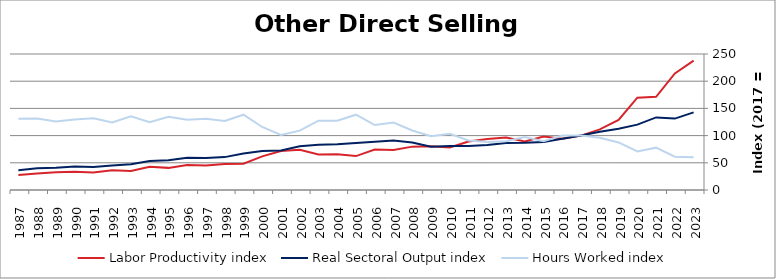
| Category | Labor Productivity index | Real Sectoral Output index | Hours Worked index |
|---|---|---|---|
| 2023.0 | 237.944 | 142.778 | 60.005 |
| 2022.0 | 214.311 | 131.26 | 61.247 |
| 2021.0 | 171.4 | 133.447 | 77.857 |
| 2020.0 | 169.617 | 120.177 | 70.852 |
| 2019.0 | 128.907 | 112.681 | 87.413 |
| 2018.0 | 111.369 | 107.081 | 96.15 |
| 2017.0 | 100 | 100 | 100 |
| 2016.0 | 94.161 | 94.391 | 100.244 |
| 2015.0 | 98.391 | 88.368 | 89.814 |
| 2014.0 | 89.083 | 86.84 | 97.482 |
| 2013.0 | 96.622 | 86.466 | 89.489 |
| 2012.0 | 93.947 | 82.825 | 88.161 |
| 2011.0 | 88.966 | 81.053 | 91.105 |
| 2010.0 | 78.184 | 80.893 | 103.465 |
| 2009.0 | 80.409 | 79.535 | 98.913 |
| 2008.0 | 79.714 | 87.184 | 109.372 |
| 2007.0 | 73.559 | 91.106 | 123.855 |
| 2006.0 | 74.394 | 88.855 | 119.44 |
| 2005.0 | 62.354 | 86.305 | 138.411 |
| 2004.0 | 65.921 | 84.005 | 127.433 |
| 2003.0 | 65.313 | 83.274 | 127.5 |
| 2002.0 | 73.811 | 80.492 | 109.05 |
| 2001.0 | 71.766 | 72.693 | 101.291 |
| 2000.0 | 61.864 | 71.681 | 115.868 |
| 1999.0 | 48.403 | 66.982 | 138.384 |
| 1998.0 | 47.643 | 60.454 | 126.89 |
| 1997.0 | 44.94 | 58.955 | 131.184 |
| 1996.0 | 46.109 | 59.491 | 129.022 |
| 1995.0 | 40.677 | 54.695 | 134.462 |
| 1994.0 | 42.788 | 53.303 | 124.575 |
| 1993.0 | 34.849 | 47.212 | 135.476 |
| 1992.0 | 36.153 | 44.95 | 124.331 |
| 1991.0 | 32.158 | 42.397 | 131.84 |
| 1990.0 | 33.432 | 43.255 | 129.381 |
| 1989.0 | 32.409 | 40.848 | 126.04 |
| 1988.0 | 30.382 | 39.979 | 131.588 |
| 1987.0 | 27.646 | 36.205 | 130.961 |